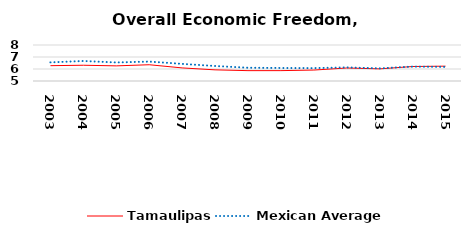
| Category | Tamaulipas | Mexican Average  |
|---|---|---|
| 2003.0 | 6.276 | 6.552 |
| 2004.0 | 6.313 | 6.668 |
| 2005.0 | 6.26 | 6.546 |
| 2006.0 | 6.355 | 6.619 |
| 2007.0 | 6.09 | 6.428 |
| 2008.0 | 5.929 | 6.248 |
| 2009.0 | 5.863 | 6.106 |
| 2010.0 | 5.864 | 6.086 |
| 2011.0 | 5.913 | 6.074 |
| 2012.0 | 6.083 | 6.134 |
| 2013.0 | 6.012 | 6.054 |
| 2014.0 | 6.208 | 6.2 |
| 2015.0 | 6.237 | 6.174 |